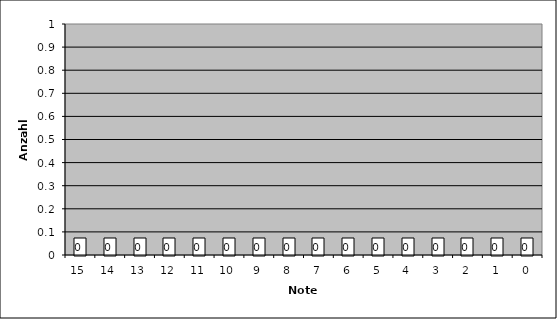
| Category | Series 1 |
|---|---|
| 0.0 | 0 |
| 1.0 | 0 |
| 2.0 | 0 |
| 3.0 | 0 |
| 4.0 | 0 |
| 5.0 | 0 |
| 6.0 | 0 |
| 7.0 | 0 |
| 8.0 | 0 |
| 9.0 | 0 |
| 10.0 | 0 |
| 11.0 | 0 |
| 12.0 | 0 |
| 13.0 | 0 |
| 14.0 | 0 |
| 15.0 | 0 |